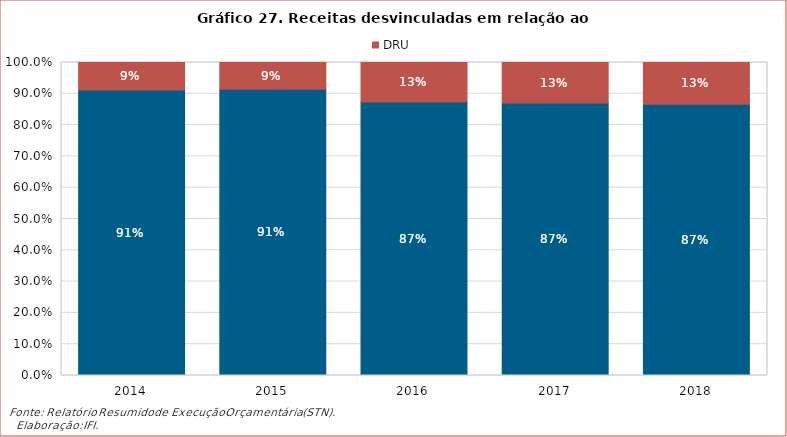
| Category | Receitas Totais | DRU |
|---|---|---|
| 2014.0 | 0.912 | 0.088 |
| 2015.0 | 0.914 | 0.086 |
| 2016.0 | 0.874 | 0.126 |
| 2017.0 | 0.871 | 0.129 |
| 2018.0 | 0.867 | 0.133 |